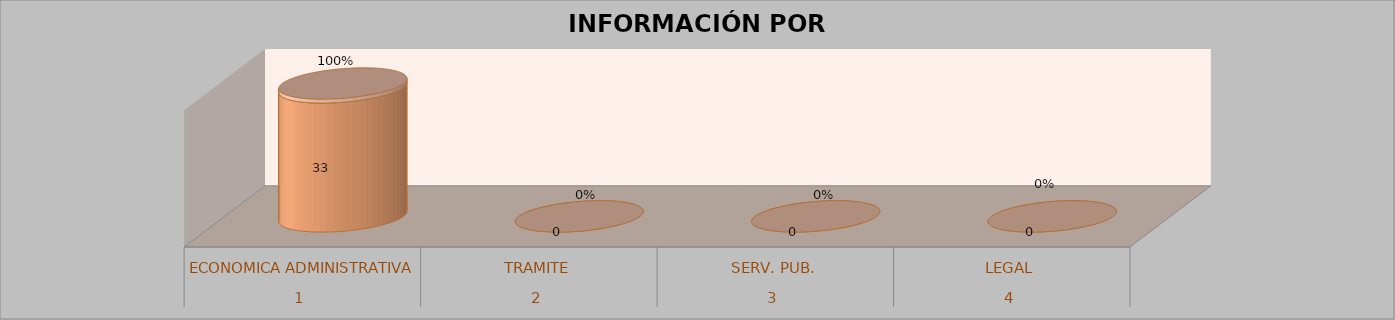
| Category | Series 0 | Series 1 | Series 2 | Series 3 |
|---|---|---|---|---|
| 0 |  |  | 33 | 1 |
| 1 |  |  | 0 | 0 |
| 2 |  |  | 0 | 0 |
| 3 |  |  | 0 | 0 |